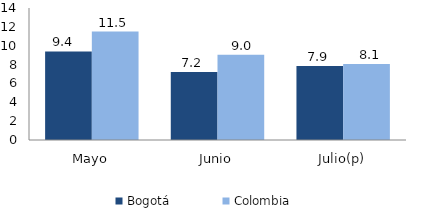
| Category | Bogotá | Colombia |
|---|---|---|
| Mayo | 9.391 | 11.504 |
| Junio | 7.212 | 9.047 |
| Julio(p) | 7.859 | 8.068 |